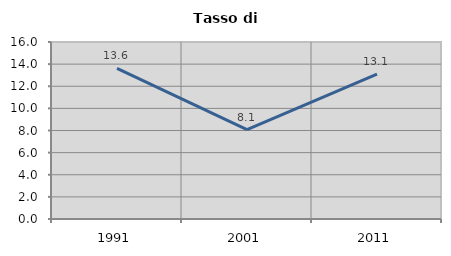
| Category | Tasso di disoccupazione   |
|---|---|
| 1991.0 | 13.611 |
| 2001.0 | 8.071 |
| 2011.0 | 13.095 |